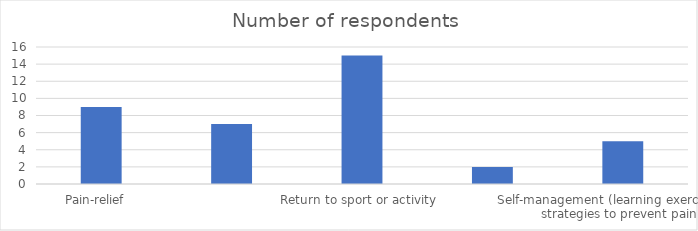
| Category | Number of respondents  |
|---|---|
| Pain-relief   | 9 |
| Education (understanding causes of knee pain)  | 7 |
| Return to sport or activity  | 15 |
| Sport performance goals  | 2 |
| Self-management (learning exercises and strategies to prevent pain)  | 5 |